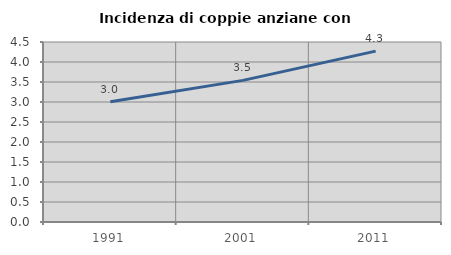
| Category | Incidenza di coppie anziane con figli |
|---|---|
| 1991.0 | 3.005 |
| 2001.0 | 3.541 |
| 2011.0 | 4.272 |